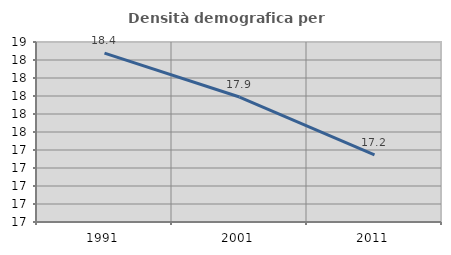
| Category | Densità demografica |
|---|---|
| 1991.0 | 18.377 |
| 2001.0 | 17.889 |
| 2011.0 | 17.247 |